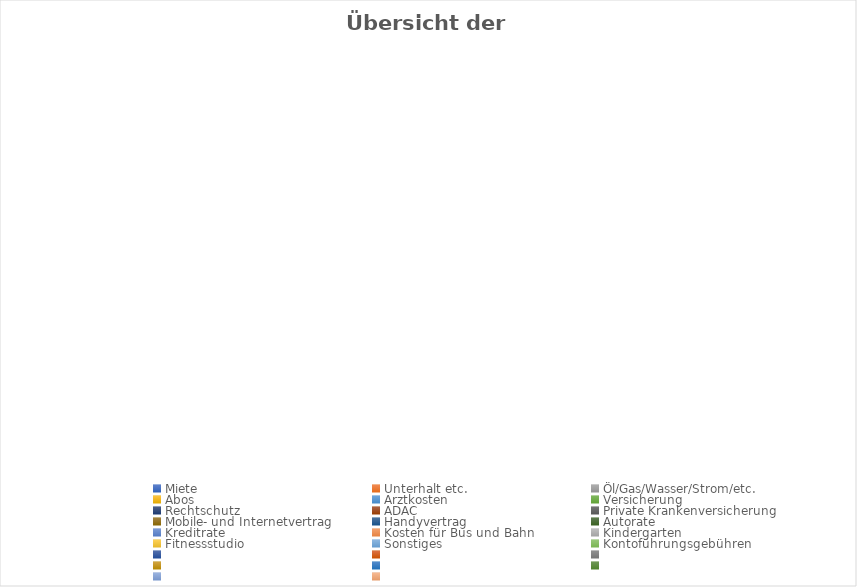
| Category | Series 0 | Series 1 | Series 2 |
|---|---|---|---|
| Miete | 0 |  |  |
| Unterhalt etc. | 0 |  |  |
| Öl/Gas/Wasser/Strom/etc. | 0 |  |  |
| Abos | 0 |  |  |
| Arztkosten | 0 |  |  |
| Versicherung | 0 |  |  |
| Rechtschutz | 0 |  |  |
| ADAC | 0 |  |  |
| Private Krankenversicherung | 0 |  |  |
| Mobile- und Internetvertrag | 0 |  |  |
| Handyvertrag | 0 |  |  |
| Autorate | 0 |  |  |
| Kreditrate | 0 |  |  |
| Kosten für Bus und Bahn | 0 |  |  |
| Kindergarten | 0 |  |  |
| Fitnessstudio | 0 |  |  |
| Sonstiges | 0 |  |  |
| Kontoführungsgebühren | 0 |  |  |